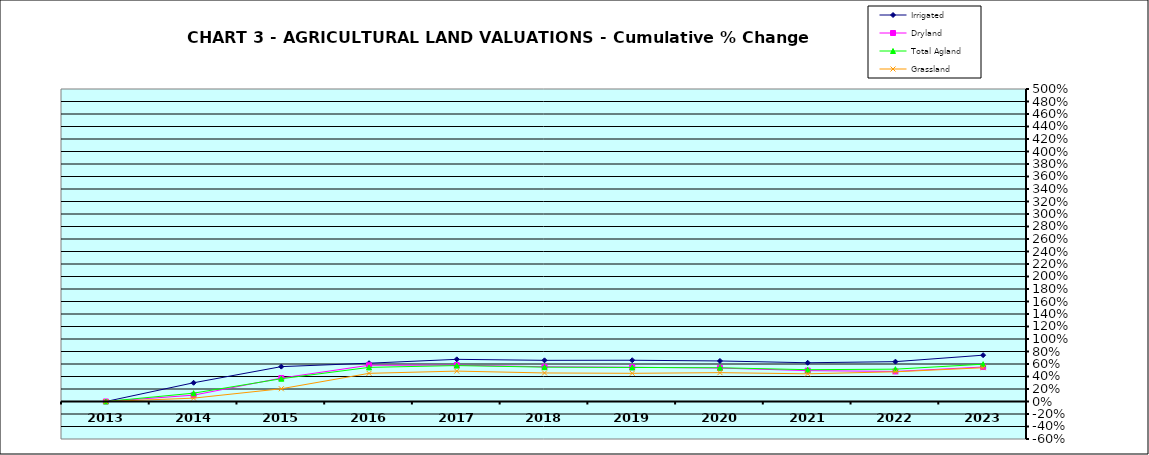
| Category | Irrigated | Dryland | Total Agland | Grassland |
|---|---|---|---|---|
| 2013.0 | 0 | 0 | 0 | 0 |
| 2014.0 | 0.3 | 0.102 | 0.133 | 0.054 |
| 2015.0 | 0.558 | 0.375 | 0.364 | 0.204 |
| 2016.0 | 0.613 | 0.58 | 0.546 | 0.451 |
| 2017.0 | 0.675 | 0.582 | 0.575 | 0.486 |
| 2018.0 | 0.659 | 0.556 | 0.55 | 0.457 |
| 2019.0 | 0.66 | 0.548 | 0.545 | 0.451 |
| 2020.0 | 0.649 | 0.535 | 0.54 | 0.462 |
| 2021.0 | 0.62 | 0.494 | 0.509 | 0.443 |
| 2022.0 | 0.638 | 0.481 | 0.517 | 0.475 |
| 2023.0 | 0.741 | 0.552 | 0.597 | 0.54 |